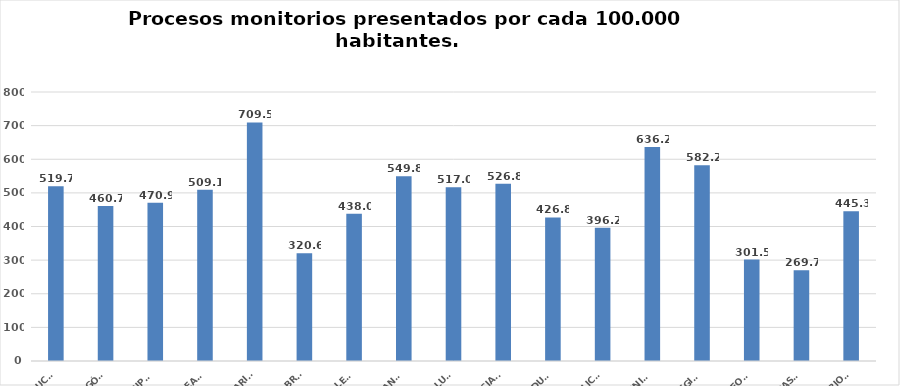
| Category | Series 0 |
|---|---|
| ANDALUCÍA | 519.694 |
| ARAGÓN | 460.748 |
| ASTURIAS, PRINCIPADO | 470.89 |
| ILLES BALEARS | 509.146 |
| CANARIAS | 709.52 |
| CANTABRIA | 320.63 |
| CASTILLA - LEÓN | 438.016 |
| CASTILLA - LA MANCHA | 549.787 |
| CATALUÑA | 517.011 |
| C. VALENCIANA | 526.784 |
| EXTREMADURA | 426.821 |
| GALICIA | 396.227 |
| MADRID, COMUNIDAD | 636.228 |
| MURCIA, REGIÓN | 582.152 |
| NAVARRA, COM. FORAL | 301.547 |
| PAÍS VASCO | 269.741 |
| LA RIOJA | 445.288 |